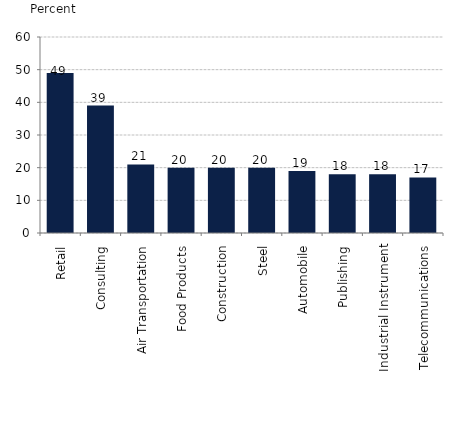
| Category | Impact of a 10% improvement in data usability on productivity (sales per employee) |
|---|---|
| Retail | 49 |
| Consulting | 39 |
| Air Transportation | 21 |
| Food Products | 20 |
| Construction | 20 |
| Steel | 20 |
| Automobile | 19 |
| Publishing | 18 |
| Industrial Instrument | 18 |
| Telecommunications | 17 |